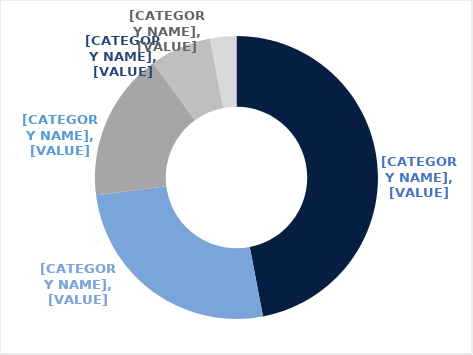
| Category | Series 0 |
|---|---|
| Regional | 0.47 |
| Sub regional | 0.26 |
| Outlet | 0.17 |
| Neighbourhood | 0.07 |
| CBD Retail | 0.03 |